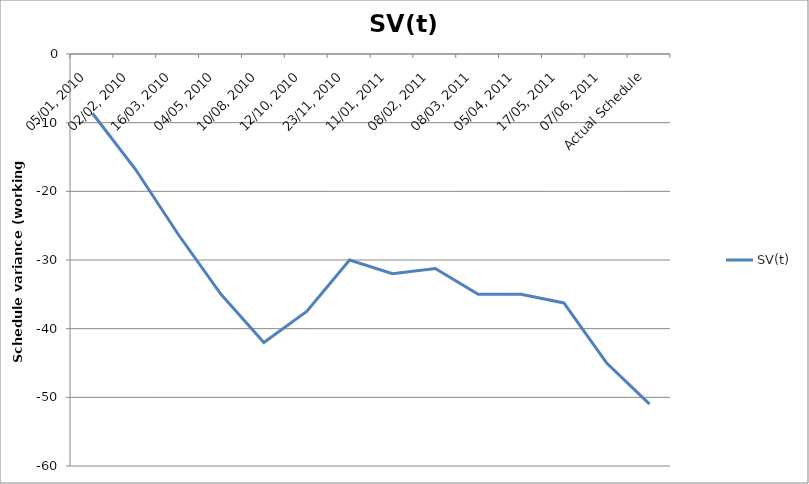
| Category | SV(t) |
|---|---|
| 05/01, 2010 | -8.625 |
| 02/02, 2010 | -16.75 |
| 16/03, 2010 | -26.25 |
| 04/05, 2010 | -35 |
| 10/08, 2010 | -42 |
| 12/10, 2010 | -37.5 |
| 23/11, 2010 | -30 |
| 11/01, 2011 | -32 |
| 08/02, 2011 | -31.25 |
| 08/03, 2011 | -35 |
| 05/04, 2011 | -35 |
| 17/05, 2011 | -36.25 |
| 07/06, 2011 | -45 |
| Actual Schedule | -51 |